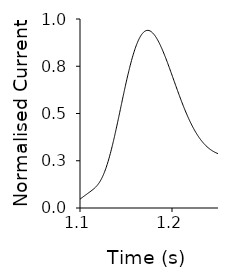
| Category | Ammonium pH 8 in pH 5 out |
|---|---|
| 0.0 | -0.187 |
| 0.001 | -0.187 |
| 0.002 | -0.187 |
| 0.003 | -0.187 |
| 0.004 | -0.187 |
| 0.005 | -0.187 |
| 0.006 | -0.187 |
| 0.007 | -0.187 |
| 0.008 | -0.186 |
| 0.009 | -0.186 |
| 0.01 | -0.185 |
| 0.011 | -0.185 |
| 0.012 | -0.184 |
| 0.013 | -0.184 |
| 0.014 | -0.183 |
| 0.015 | -0.182 |
| 0.016 | -0.181 |
| 0.017 | -0.18 |
| 0.018 | -0.179 |
| 0.019 | -0.178 |
| 0.02 | -0.177 |
| 0.021 | -0.176 |
| 0.022 | -0.175 |
| 0.023 | -0.174 |
| 0.024 | -0.173 |
| 0.025 | -0.172 |
| 0.026 | -0.171 |
| 0.027 | -0.17 |
| 0.028 | -0.17 |
| 0.029 | -0.169 |
| 0.03 | -0.169 |
| 0.031 | -0.169 |
| 0.032 | -0.169 |
| 0.033 | -0.17 |
| 0.034 | -0.17 |
| 0.035 | -0.171 |
| 0.036 | -0.172 |
| 0.037 | -0.173 |
| 0.038 | -0.174 |
| 0.039 | -0.175 |
| 0.04 | -0.176 |
| 0.041 | -0.178 |
| 0.042 | -0.179 |
| 0.043 | -0.181 |
| 0.044 | -0.182 |
| 0.045 | -0.183 |
| 0.046 | -0.185 |
| 0.047 | -0.186 |
| 0.048 | -0.187 |
| 0.049 | -0.188 |
| 0.05 | -0.189 |
| 0.051 | -0.19 |
| 0.052 | -0.19 |
| 0.053 | -0.191 |
| 0.054 | -0.191 |
| 0.055 | -0.191 |
| 0.056 | -0.19 |
| 0.057 | -0.19 |
| 0.058 | -0.189 |
| 0.059 | -0.188 |
| 0.06 | -0.187 |
| 0.061 | -0.186 |
| 0.062 | -0.184 |
| 0.063 | -0.182 |
| 0.064 | -0.18 |
| 0.065 | -0.178 |
| 0.066 | -0.176 |
| 0.067 | -0.173 |
| 0.068 | -0.17 |
| 0.069 | -0.168 |
| 0.07 | -0.165 |
| 0.071 | -0.162 |
| 0.072 | -0.159 |
| 0.073 | -0.156 |
| 0.074 | -0.153 |
| 0.075 | -0.149 |
| 0.076 | -0.146 |
| 0.077 | -0.143 |
| 0.078 | -0.14 |
| 0.079 | -0.137 |
| 0.08 | -0.134 |
| 0.081 | -0.131 |
| 0.082 | -0.128 |
| 0.083 | -0.126 |
| 0.084 | -0.123 |
| 0.085 | -0.121 |
| 0.086 | -0.118 |
| 0.087 | -0.116 |
| 0.088 | -0.115 |
| 0.089 | -0.113 |
| 0.09 | -0.112 |
| 0.091 | -0.11 |
| 0.092 | -0.109 |
| 0.093 | -0.109 |
| 0.094 | -0.109 |
| 0.095 | -0.109 |
| 0.096 | -0.109 |
| 0.097 | -0.11 |
| 0.098 | -0.111 |
| 0.099 | -0.112 |
| 0.1 | -0.114 |
| 0.101 | -0.116 |
| 0.102 | -0.118 |
| 0.103 | -0.121 |
| 0.104 | -0.124 |
| 0.105 | -0.128 |
| 0.106 | -0.132 |
| 0.107 | -0.136 |
| 0.108 | -0.141 |
| 0.109 | -0.146 |
| 0.11 | -0.151 |
| 0.111 | -0.157 |
| 0.112 | -0.163 |
| 0.113 | -0.169 |
| 0.114 | -0.175 |
| 0.115 | -0.182 |
| 0.116 | -0.189 |
| 0.117 | -0.196 |
| 0.118 | -0.203 |
| 0.119 | -0.211 |
| 0.12 | -0.218 |
| 0.121 | -0.226 |
| 0.122 | -0.234 |
| 0.123 | -0.241 |
| 0.124 | -0.249 |
| 0.125 | -0.257 |
| 0.126 | -0.264 |
| 0.127 | -0.272 |
| 0.128 | -0.279 |
| 0.129 | -0.286 |
| 0.13 | -0.293 |
| 0.131 | -0.3 |
| 0.132 | -0.307 |
| 0.133 | -0.313 |
| 0.134 | -0.319 |
| 0.135 | -0.325 |
| 0.136 | -0.33 |
| 0.137 | -0.335 |
| 0.138 | -0.339 |
| 0.139 | -0.344 |
| 0.14 | -0.347 |
| 0.141 | -0.351 |
| 0.142 | -0.353 |
| 0.143 | -0.356 |
| 0.144 | -0.358 |
| 0.145 | -0.359 |
| 0.146 | -0.36 |
| 0.147 | -0.361 |
| 0.148 | -0.361 |
| 0.149 | -0.36 |
| 0.15 | -0.359 |
| 0.151 | -0.358 |
| 0.152 | -0.356 |
| 0.153 | -0.354 |
| 0.154 | -0.351 |
| 0.155 | -0.347 |
| 0.156 | -0.344 |
| 0.157 | -0.34 |
| 0.158 | -0.335 |
| 0.159 | -0.33 |
| 0.16 | -0.325 |
| 0.161 | -0.32 |
| 0.162 | -0.314 |
| 0.163 | -0.307 |
| 0.164 | -0.301 |
| 0.165 | -0.294 |
| 0.166 | -0.287 |
| 0.167 | -0.28 |
| 0.168 | -0.272 |
| 0.169 | -0.264 |
| 0.17 | -0.256 |
| 0.171 | -0.248 |
| 0.172 | -0.24 |
| 0.173 | -0.232 |
| 0.174 | -0.223 |
| 0.175 | -0.215 |
| 0.176 | -0.206 |
| 0.177 | -0.197 |
| 0.178 | -0.189 |
| 0.179 | -0.18 |
| 0.18 | -0.171 |
| 0.181 | -0.163 |
| 0.182 | -0.154 |
| 0.183 | -0.146 |
| 0.184 | -0.138 |
| 0.185 | -0.129 |
| 0.186 | -0.121 |
| 0.187 | -0.113 |
| 0.188 | -0.105 |
| 0.189 | -0.098 |
| 0.19 | -0.09 |
| 0.191 | -0.083 |
| 0.192 | -0.076 |
| 0.193 | -0.069 |
| 0.194 | -0.062 |
| 0.195 | -0.056 |
| 0.196 | -0.049 |
| 0.197 | -0.044 |
| 0.198 | -0.038 |
| 0.199 | -0.033 |
| 0.2 | -0.027 |
| 0.201 | -0.023 |
| 0.202 | -0.018 |
| 0.203 | -0.014 |
| 0.204 | -0.01 |
| 0.205 | -0.006 |
| 0.206 | -0.003 |
| 0.207 | 0.001 |
| 0.208 | 0.003 |
| 0.209 | 0.006 |
| 0.21 | 0.008 |
| 0.211 | 0.01 |
| 0.212 | 0.012 |
| 0.213 | 0.014 |
| 0.214 | 0.015 |
| 0.215 | 0.016 |
| 0.216 | 0.017 |
| 0.217 | 0.017 |
| 0.218 | 0.018 |
| 0.219 | 0.018 |
| 0.22 | 0.018 |
| 0.221 | 0.017 |
| 0.222 | 0.017 |
| 0.223 | 0.016 |
| 0.224 | 0.015 |
| 0.225 | 0.014 |
| 0.226 | 0.013 |
| 0.227 | 0.012 |
| 0.228 | 0.011 |
| 0.229 | 0.009 |
| 0.23 | 0.007 |
| 0.231 | 0.006 |
| 0.232 | 0.004 |
| 0.233 | 0.002 |
| 0.234 | 0 |
| 0.235 | -0.002 |
| 0.236 | -0.005 |
| 0.237 | -0.007 |
| 0.238 | -0.009 |
| 0.239 | -0.011 |
| 0.24 | -0.014 |
| 0.241 | -0.016 |
| 0.242 | -0.019 |
| 0.243 | -0.021 |
| 0.244 | -0.024 |
| 0.245 | -0.026 |
| 0.246 | -0.028 |
| 0.247 | -0.031 |
| 0.248 | -0.033 |
| 0.249 | -0.036 |
| 0.25 | -0.038 |
| 0.251 | -0.041 |
| 0.252 | -0.043 |
| 0.253 | -0.046 |
| 0.254 | -0.048 |
| 0.255 | -0.05 |
| 0.256 | -0.053 |
| 0.257 | -0.055 |
| 0.258 | -0.057 |
| 0.259 | -0.059 |
| 0.26 | -0.061 |
| 0.261 | -0.063 |
| 0.262 | -0.065 |
| 0.263 | -0.067 |
| 0.264 | -0.069 |
| 0.265 | -0.071 |
| 0.266 | -0.073 |
| 0.267 | -0.075 |
| 0.268 | -0.077 |
| 0.269 | -0.078 |
| 0.27 | -0.08 |
| 0.271 | -0.081 |
| 0.272 | -0.083 |
| 0.273 | -0.084 |
| 0.274 | -0.085 |
| 0.275 | -0.087 |
| 0.276 | -0.088 |
| 0.277 | -0.089 |
| 0.278 | -0.09 |
| 0.279 | -0.091 |
| 0.28 | -0.092 |
| 0.281 | -0.093 |
| 0.282 | -0.094 |
| 0.283 | -0.095 |
| 0.284 | -0.096 |
| 0.285 | -0.096 |
| 0.286 | -0.097 |
| 0.287 | -0.098 |
| 0.288 | -0.098 |
| 0.289 | -0.099 |
| 0.29 | -0.099 |
| 0.291 | -0.1 |
| 0.292 | -0.1 |
| 0.293 | -0.1 |
| 0.294 | -0.101 |
| 0.295 | -0.101 |
| 0.296 | -0.102 |
| 0.297 | -0.102 |
| 0.298 | -0.102 |
| 0.299 | -0.102 |
| 0.3 | -0.103 |
| 0.301 | -0.103 |
| 0.302 | -0.103 |
| 0.303 | -0.103 |
| 0.304 | -0.104 |
| 0.305 | -0.104 |
| 0.306 | -0.104 |
| 0.307 | -0.105 |
| 0.308 | -0.105 |
| 0.309 | -0.105 |
| 0.31 | -0.106 |
| 0.311 | -0.106 |
| 0.312 | -0.107 |
| 0.313 | -0.108 |
| 0.314 | -0.108 |
| 0.315 | -0.109 |
| 0.316 | -0.11 |
| 0.317 | -0.112 |
| 0.318 | -0.113 |
| 0.319 | -0.114 |
| 0.32 | -0.116 |
| 0.321 | -0.118 |
| 0.322 | -0.12 |
| 0.323 | -0.122 |
| 0.324 | -0.124 |
| 0.325 | -0.126 |
| 0.326 | -0.128 |
| 0.327 | -0.131 |
| 0.328 | -0.134 |
| 0.329 | -0.136 |
| 0.33 | -0.139 |
| 0.331 | -0.141 |
| 0.332 | -0.144 |
| 0.333 | -0.147 |
| 0.334 | -0.149 |
| 0.335 | -0.152 |
| 0.336 | -0.154 |
| 0.337 | -0.156 |
| 0.338 | -0.158 |
| 0.339 | -0.16 |
| 0.34 | -0.161 |
| 0.341 | -0.162 |
| 0.342 | -0.162 |
| 0.343 | -0.161 |
| 0.344 | -0.159 |
| 0.345 | -0.156 |
| 0.346 | -0.152 |
| 0.347 | -0.147 |
| 0.348 | -0.14 |
| 0.349 | -0.132 |
| 0.35 | -0.122 |
| 0.351 | -0.11 |
| 0.352 | -0.097 |
| 0.353 | -0.081 |
| 0.354 | -0.064 |
| 0.355 | -0.044 |
| 0.356 | -0.022 |
| 0.357 | 0.001 |
| 0.358 | 0.027 |
| 0.359 | 0.056 |
| 0.36 | 0.086 |
| 0.361 | 0.119 |
| 0.362 | 0.154 |
| 0.363 | 0.191 |
| 0.364 | 0.23 |
| 0.365 | 0.271 |
| 0.366 | 0.314 |
| 0.367 | 0.359 |
| 0.368 | 0.406 |
| 0.369 | 0.454 |
| 0.37 | 0.503 |
| 0.371 | 0.554 |
| 0.372 | 0.606 |
| 0.373 | 0.658 |
| 0.374 | 0.712 |
| 0.375 | 0.765 |
| 0.376 | 0.82 |
| 0.377 | 0.874 |
| 0.378 | 0.929 |
| 0.379 | 0.983 |
| 0.38 | 1.037 |
| 0.381 | 1.091 |
| 0.382 | 1.144 |
| 0.383 | 1.196 |
| 0.384 | 1.247 |
| 0.385 | 1.297 |
| 0.386 | 1.346 |
| 0.387 | 1.393 |
| 0.388 | 1.44 |
| 0.389 | 1.484 |
| 0.39 | 1.527 |
| 0.391 | 1.568 |
| 0.392 | 1.607 |
| 0.393 | 1.645 |
| 0.394 | 1.68 |
| 0.395 | 1.714 |
| 0.396 | 1.746 |
| 0.397 | 1.775 |
| 0.398 | 1.803 |
| 0.399 | 1.828 |
| 0.4 | 1.852 |
| 0.401 | 1.873 |
| 0.402 | 1.892 |
| 0.403 | 1.909 |
| 0.404 | 1.924 |
| 0.405 | 1.937 |
| 0.406 | 1.948 |
| 0.407 | 1.956 |
| 0.408 | 1.963 |
| 0.409 | 1.968 |
| 0.41 | 1.97 |
| 0.411 | 1.971 |
| 0.412 | 1.971 |
| 0.413 | 1.968 |
| 0.414 | 1.964 |
| 0.415 | 1.957 |
| 0.416 | 1.95 |
| 0.417 | 1.941 |
| 0.418 | 1.93 |
| 0.419 | 1.918 |
| 0.42 | 1.905 |
| 0.421 | 1.89 |
| 0.422 | 1.874 |
| 0.423 | 1.857 |
| 0.424 | 1.839 |
| 0.425 | 1.82 |
| 0.426 | 1.8 |
| 0.427 | 1.779 |
| 0.428 | 1.757 |
| 0.429 | 1.735 |
| 0.43 | 1.712 |
| 0.431 | 1.688 |
| 0.432 | 1.664 |
| 0.433 | 1.64 |
| 0.434 | 1.615 |
| 0.435 | 1.589 |
| 0.436 | 1.564 |
| 0.437 | 1.538 |
| 0.438 | 1.512 |
| 0.439 | 1.486 |
| 0.44 | 1.46 |
| 0.441 | 1.433 |
| 0.442 | 1.407 |
| 0.443 | 1.38 |
| 0.444 | 1.354 |
| 0.445 | 1.327 |
| 0.446 | 1.301 |
| 0.447 | 1.275 |
| 0.448 | 1.249 |
| 0.449 | 1.223 |
| 0.45 | 1.197 |
| 0.451 | 1.172 |
| 0.452 | 1.147 |
| 0.453 | 1.122 |
| 0.454 | 1.097 |
| 0.455 | 1.073 |
| 0.456 | 1.049 |
| 0.457 | 1.026 |
| 0.458 | 1.003 |
| 0.459 | 0.98 |
| 0.46 | 0.958 |
| 0.461 | 0.936 |
| 0.462 | 0.915 |
| 0.463 | 0.894 |
| 0.464 | 0.874 |
| 0.465 | 0.854 |
| 0.466 | 0.835 |
| 0.467 | 0.816 |
| 0.468 | 0.798 |
| 0.469 | 0.78 |
| 0.47 | 0.764 |
| 0.471 | 0.747 |
| 0.472 | 0.732 |
| 0.473 | 0.716 |
| 0.474 | 0.702 |
| 0.475 | 0.688 |
| 0.476 | 0.675 |
| 0.477 | 0.662 |
| 0.478 | 0.65 |
| 0.479 | 0.639 |
| 0.48 | 0.628 |
| 0.481 | 0.618 |
| 0.482 | 0.608 |
| 0.483 | 0.599 |
| 0.484 | 0.591 |
| 0.485 | 0.583 |
| 0.486 | 0.576 |
| 0.487 | 0.569 |
| 0.488 | 0.562 |
| 0.489 | 0.556 |
| 0.49 | 0.551 |
| 0.491 | 0.546 |
| 0.492 | 0.542 |
| 0.493 | 0.537 |
| 0.494 | 0.534 |
| 0.495 | 0.53 |
| 0.496 | 0.527 |
| 0.497 | 0.525 |
| 0.498 | 0.523 |
| 0.499 | 0.521 |
| 0.5 | 0.519 |
| 0.501 | 0.517 |
| 0.502 | 0.516 |
| 0.503 | 0.515 |
| 0.504 | 0.515 |
| 0.505 | 0.514 |
| 0.506 | 0.514 |
| 0.507 | 0.514 |
| 0.508 | 0.514 |
| 0.509 | 0.514 |
| 0.51 | 0.514 |
| 0.511 | 0.515 |
| 0.512 | 0.515 |
| 0.513 | 0.516 |
| 0.514 | 0.516 |
| 0.515 | 0.517 |
| 0.516 | 0.517 |
| 0.517 | 0.518 |
| 0.518 | 0.519 |
| 0.519 | 0.519 |
| 0.52 | 0.52 |
| 0.521 | 0.521 |
| 0.522 | 0.521 |
| 0.523 | 0.522 |
| 0.524 | 0.523 |
| 0.525 | 0.523 |
| 0.526 | 0.523 |
| 0.527 | 0.524 |
| 0.528 | 0.524 |
| 0.529 | 0.524 |
| 0.53 | 0.524 |
| 0.531 | 0.524 |
| 0.532 | 0.524 |
| 0.533 | 0.524 |
| 0.534 | 0.524 |
| 0.535 | 0.523 |
| 0.536 | 0.523 |
| 0.537 | 0.522 |
| 0.538 | 0.522 |
| 0.539 | 0.521 |
| 0.54 | 0.52 |
| 0.541 | 0.519 |
| 0.542 | 0.518 |
| 0.543 | 0.516 |
| 0.544 | 0.515 |
| 0.545 | 0.513 |
| 0.546 | 0.512 |
| 0.547 | 0.51 |
| 0.548 | 0.508 |
| 0.549 | 0.505 |
| 0.55 | 0.503 |
| 0.551 | 0.501 |
| 0.552 | 0.498 |
| 0.553 | 0.495 |
| 0.554 | 0.492 |
| 0.555 | 0.489 |
| 0.556 | 0.486 |
| 0.557 | 0.482 |
| 0.558 | 0.479 |
| 0.559 | 0.475 |
| 0.56 | 0.471 |
| 0.561 | 0.467 |
| 0.562 | 0.463 |
| 0.563 | 0.459 |
| 0.564 | 0.454 |
| 0.565 | 0.45 |
| 0.566 | 0.445 |
| 0.567 | 0.44 |
| 0.568 | 0.436 |
| 0.569 | 0.431 |
| 0.57 | 0.425 |
| 0.571 | 0.42 |
| 0.572 | 0.415 |
| 0.573 | 0.41 |
| 0.574 | 0.404 |
| 0.575 | 0.399 |
| 0.576 | 0.393 |
| 0.577 | 0.388 |
| 0.578 | 0.382 |
| 0.579 | 0.377 |
| 0.58 | 0.371 |
| 0.581 | 0.365 |
| 0.582 | 0.36 |
| 0.583 | 0.354 |
| 0.584 | 0.348 |
| 0.585 | 0.342 |
| 0.586 | 0.336 |
| 0.587 | 0.331 |
| 0.588 | 0.325 |
| 0.589 | 0.319 |
| 0.59 | 0.313 |
| 0.591 | 0.307 |
| 0.592 | 0.301 |
| 0.593 | 0.295 |
| 0.594 | 0.289 |
| 0.595 | 0.283 |
| 0.596 | 0.277 |
| 0.597 | 0.271 |
| 0.598 | 0.265 |
| 0.599 | 0.26 |
| 0.6 | 0.254 |
| 0.601 | 0.248 |
| 0.602 | 0.242 |
| 0.603 | 0.236 |
| 0.604 | 0.23 |
| 0.605 | 0.225 |
| 0.606 | 0.219 |
| 0.607 | 0.213 |
| 0.608 | 0.207 |
| 0.609 | 0.202 |
| 0.61 | 0.196 |
| 0.611 | 0.191 |
| 0.612 | 0.186 |
| 0.613 | 0.18 |
| 0.614 | 0.175 |
| 0.615 | 0.17 |
| 0.616 | 0.165 |
| 0.617 | 0.16 |
| 0.618 | 0.155 |
| 0.619 | 0.15 |
| 0.62 | 0.146 |
| 0.621 | 0.141 |
| 0.622 | 0.137 |
| 0.623 | 0.133 |
| 0.624 | 0.128 |
| 0.625 | 0.124 |
| 0.626 | 0.12 |
| 0.627 | 0.117 |
| 0.628 | 0.113 |
| 0.629 | 0.109 |
| 0.63 | 0.106 |
| 0.631 | 0.102 |
| 0.632 | 0.099 |
| 0.633 | 0.095 |
| 0.634 | 0.092 |
| 0.635 | 0.089 |
| 0.636 | 0.086 |
| 0.637 | 0.083 |
| 0.638 | 0.08 |
| 0.639 | 0.077 |
| 0.64 | 0.074 |
| 0.641 | 0.072 |
| 0.642 | 0.069 |
| 0.643 | 0.066 |
| 0.644 | 0.064 |
| 0.645 | 0.061 |
| 0.646 | 0.059 |
| 0.647 | 0.057 |
| 0.648 | 0.055 |
| 0.649 | 0.052 |
| 0.65 | 0.05 |
| 0.651 | 0.048 |
| 0.652 | 0.046 |
| 0.653 | 0.044 |
| 0.654 | 0.042 |
| 0.655 | 0.041 |
| 0.656 | 0.039 |
| 0.657 | 0.038 |
| 0.658 | 0.036 |
| 0.659 | 0.035 |
| 0.66 | 0.033 |
| 0.661 | 0.032 |
| 0.662 | 0.031 |
| 0.663 | 0.03 |
| 0.664 | 0.03 |
| 0.665 | 0.029 |
| 0.666 | 0.028 |
| 0.667 | 0.028 |
| 0.668 | 0.028 |
| 0.669 | 0.027 |
| 0.67 | 0.027 |
| 0.671 | 0.028 |
| 0.672 | 0.028 |
| 0.673 | 0.028 |
| 0.674 | 0.029 |
| 0.675 | 0.029 |
| 0.676 | 0.03 |
| 0.677 | 0.031 |
| 0.678 | 0.032 |
| 0.679 | 0.033 |
| 0.68 | 0.034 |
| 0.681 | 0.036 |
| 0.682 | 0.037 |
| 0.683 | 0.039 |
| 0.684 | 0.04 |
| 0.685 | 0.042 |
| 0.686 | 0.043 |
| 0.687 | 0.045 |
| 0.688 | 0.047 |
| 0.689 | 0.048 |
| 0.69 | 0.05 |
| 0.691 | 0.052 |
| 0.692 | 0.054 |
| 0.693 | 0.055 |
| 0.694 | 0.057 |
| 0.695 | 0.059 |
| 0.696 | 0.06 |
| 0.697 | 0.062 |
| 0.698 | 0.063 |
| 0.699 | 0.065 |
| 0.7 | 0.066 |
| 0.701 | 0.067 |
| 0.702 | 0.068 |
| 0.703 | 0.069 |
| 0.704 | 0.07 |
| 0.705 | 0.071 |
| 0.706 | 0.072 |
| 0.707 | 0.073 |
| 0.708 | 0.073 |
| 0.709 | 0.074 |
| 0.71 | 0.074 |
| 0.711 | 0.075 |
| 0.712 | 0.075 |
| 0.713 | 0.075 |
| 0.714 | 0.076 |
| 0.715 | 0.076 |
| 0.716 | 0.076 |
| 0.717 | 0.076 |
| 0.718 | 0.076 |
| 0.719 | 0.075 |
| 0.72 | 0.075 |
| 0.721 | 0.075 |
| 0.722 | 0.075 |
| 0.723 | 0.075 |
| 0.724 | 0.074 |
| 0.725 | 0.074 |
| 0.726 | 0.074 |
| 0.727 | 0.073 |
| 0.728 | 0.073 |
| 0.729 | 0.073 |
| 0.73 | 0.073 |
| 0.731 | 0.072 |
| 0.732 | 0.072 |
| 0.733 | 0.072 |
| 0.734 | 0.071 |
| 0.735 | 0.071 |
| 0.736 | 0.071 |
| 0.737 | 0.07 |
| 0.738 | 0.07 |
| 0.739 | 0.069 |
| 0.74 | 0.069 |
| 0.741 | 0.069 |
| 0.742 | 0.068 |
| 0.743 | 0.068 |
| 0.744 | 0.067 |
| 0.745 | 0.067 |
| 0.746 | 0.067 |
| 0.747 | 0.066 |
| 0.748 | 0.066 |
| 0.749 | 0.065 |
| 0.75 | 0.064 |
| 0.751 | 0.064 |
| 0.752 | 0.063 |
| 0.753 | 0.063 |
| 0.754 | 0.062 |
| 0.755 | 0.061 |
| 0.756 | 0.06 |
| 0.757 | 0.06 |
| 0.758 | 0.059 |
| 0.759 | 0.058 |
| 0.76 | 0.057 |
| 0.761 | 0.056 |
| 0.762 | 0.055 |
| 0.763 | 0.054 |
| 0.764 | 0.054 |
| 0.765 | 0.053 |
| 0.766 | 0.052 |
| 0.767 | 0.051 |
| 0.768 | 0.05 |
| 0.769 | 0.049 |
| 0.77 | 0.048 |
| 0.771 | 0.047 |
| 0.772 | 0.046 |
| 0.773 | 0.045 |
| 0.774 | 0.044 |
| 0.775 | 0.043 |
| 0.776 | 0.042 |
| 0.777 | 0.041 |
| 0.778 | 0.04 |
| 0.779 | 0.039 |
| 0.78 | 0.038 |
| 0.781 | 0.038 |
| 0.782 | 0.037 |
| 0.783 | 0.036 |
| 0.784 | 0.035 |
| 0.785 | 0.034 |
| 0.786 | 0.033 |
| 0.787 | 0.032 |
| 0.788 | 0.031 |
| 0.789 | 0.03 |
| 0.79 | 0.03 |
| 0.791 | 0.029 |
| 0.792 | 0.028 |
| 0.793 | 0.027 |
| 0.794 | 0.026 |
| 0.795 | 0.025 |
| 0.796 | 0.024 |
| 0.797 | 0.023 |
| 0.798 | 0.022 |
| 0.799 | 0.021 |
| 0.8 | 0.02 |
| 0.801 | 0.019 |
| 0.802 | 0.018 |
| 0.803 | 0.017 |
| 0.804 | 0.017 |
| 0.805 | 0.016 |
| 0.806 | 0.015 |
| 0.807 | 0.014 |
| 0.808 | 0.013 |
| 0.809 | 0.012 |
| 0.81 | 0.011 |
| 0.811 | 0.011 |
| 0.812 | 0.01 |
| 0.813 | 0.009 |
| 0.814 | 0.008 |
| 0.815 | 0.008 |
| 0.816 | 0.007 |
| 0.817 | 0.006 |
| 0.818 | 0.006 |
| 0.819 | 0.005 |
| 0.82 | 0.005 |
| 0.821 | 0.005 |
| 0.822 | 0.004 |
| 0.823 | 0.004 |
| 0.824 | 0.004 |
| 0.825 | 0.003 |
| 0.826 | 0.003 |
| 0.827 | 0.003 |
| 0.828 | 0.003 |
| 0.829 | 0.003 |
| 0.83 | 0.003 |
| 0.831 | 0.003 |
| 0.832 | 0.003 |
| 0.833 | 0.003 |
| 0.834 | 0.003 |
| 0.835 | 0.003 |
| 0.836 | 0.003 |
| 0.837 | 0.003 |
| 0.838 | 0.003 |
| 0.839 | 0.003 |
| 0.84 | 0.003 |
| 0.841 | 0.003 |
| 0.842 | 0.003 |
| 0.843 | 0.003 |
| 0.844 | 0.003 |
| 0.845 | 0.003 |
| 0.846 | 0.003 |
| 0.847 | 0.002 |
| 0.848 | 0.002 |
| 0.849 | 0.002 |
| 0.85 | 0.002 |
| 0.851 | 0.001 |
| 0.852 | 0.001 |
| 0.853 | 0.001 |
| 0.854 | 0 |
| 0.855 | 0 |
| 0.856 | -0.001 |
| 0.857 | -0.001 |
| 0.858 | -0.002 |
| 0.859 | -0.002 |
| 0.86 | -0.003 |
| 0.861 | -0.003 |
| 0.862 | -0.004 |
| 0.863 | -0.005 |
| 0.864 | -0.005 |
| 0.865 | -0.006 |
| 0.866 | -0.006 |
| 0.867 | -0.007 |
| 0.868 | -0.007 |
| 0.869 | -0.008 |
| 0.87 | -0.008 |
| 0.871 | -0.009 |
| 0.872 | -0.009 |
| 0.873 | -0.01 |
| 0.874 | -0.01 |
| 0.875 | -0.01 |
| 0.876 | -0.011 |
| 0.877 | -0.011 |
| 0.878 | -0.011 |
| 0.879 | -0.011 |
| 0.88 | -0.012 |
| 0.881 | -0.012 |
| 0.882 | -0.012 |
| 0.883 | -0.012 |
| 0.884 | -0.012 |
| 0.885 | -0.011 |
| 0.886 | -0.011 |
| 0.887 | -0.011 |
| 0.888 | -0.011 |
| 0.889 | -0.011 |
| 0.89 | -0.011 |
| 0.891 | -0.01 |
| 0.892 | -0.01 |
| 0.893 | -0.01 |
| 0.894 | -0.009 |
| 0.895 | -0.009 |
| 0.896 | -0.009 |
| 0.897 | -0.009 |
| 0.898 | -0.008 |
| 0.899 | -0.008 |
| 0.9 | -0.008 |
| 0.901 | -0.008 |
| 0.902 | -0.008 |
| 0.903 | -0.008 |
| 0.904 | -0.007 |
| 0.905 | -0.007 |
| 0.906 | -0.007 |
| 0.907 | -0.007 |
| 0.908 | -0.007 |
| 0.909 | -0.007 |
| 0.91 | -0.008 |
| 0.911 | -0.008 |
| 0.912 | -0.008 |
| 0.913 | -0.008 |
| 0.914 | -0.008 |
| 0.915 | -0.008 |
| 0.916 | -0.009 |
| 0.917 | -0.009 |
| 0.918 | -0.009 |
| 0.919 | -0.009 |
| 0.92 | -0.01 |
| 0.921 | -0.01 |
| 0.922 | -0.01 |
| 0.923 | -0.01 |
| 0.924 | -0.01 |
| 0.925 | -0.011 |
| 0.926 | -0.011 |
| 0.927 | -0.011 |
| 0.928 | -0.011 |
| 0.929 | -0.011 |
| 0.93 | -0.012 |
| 0.931 | -0.012 |
| 0.932 | -0.012 |
| 0.933 | -0.012 |
| 0.934 | -0.012 |
| 0.935 | -0.012 |
| 0.936 | -0.012 |
| 0.937 | -0.013 |
| 0.938 | -0.013 |
| 0.939 | -0.013 |
| 0.94 | -0.013 |
| 0.941 | -0.013 |
| 0.942 | -0.013 |
| 0.943 | -0.013 |
| 0.944 | -0.014 |
| 0.945 | -0.014 |
| 0.946 | -0.014 |
| 0.947 | -0.015 |
| 0.948 | -0.015 |
| 0.949 | -0.015 |
| 0.95 | -0.016 |
| 0.951 | -0.016 |
| 0.952 | -0.017 |
| 0.953 | -0.017 |
| 0.954 | -0.018 |
| 0.955 | -0.019 |
| 0.956 | -0.019 |
| 0.957 | -0.02 |
| 0.958 | -0.021 |
| 0.959 | -0.021 |
| 0.96 | -0.022 |
| 0.961 | -0.023 |
| 0.962 | -0.024 |
| 0.963 | -0.025 |
| 0.964 | -0.025 |
| 0.965 | -0.026 |
| 0.966 | -0.027 |
| 0.967 | -0.028 |
| 0.968 | -0.029 |
| 0.969 | -0.029 |
| 0.97 | -0.03 |
| 0.971 | -0.031 |
| 0.972 | -0.032 |
| 0.973 | -0.032 |
| 0.974 | -0.033 |
| 0.975 | -0.033 |
| 0.976 | -0.034 |
| 0.977 | -0.035 |
| 0.978 | -0.035 |
| 0.979 | -0.036 |
| 0.98 | -0.036 |
| 0.981 | -0.036 |
| 0.982 | -0.037 |
| 0.983 | -0.037 |
| 0.984 | -0.037 |
| 0.985 | -0.038 |
| 0.986 | -0.038 |
| 0.987 | -0.038 |
| 0.988 | -0.038 |
| 0.989 | -0.039 |
| 0.99 | -0.039 |
| 0.991 | -0.039 |
| 0.992 | -0.039 |
| 0.993 | -0.039 |
| 0.994 | -0.039 |
| 0.995 | -0.04 |
| 0.996 | -0.04 |
| 0.997 | -0.04 |
| 0.998 | -0.04 |
| 0.999 | -0.04 |
| 1.0 | -0.04 |
| 1.001 | -0.04 |
| 1.002 | -0.04 |
| 1.003 | -0.04 |
| 1.004 | -0.04 |
| 1.005 | -0.04 |
| 1.006 | -0.04 |
| 1.007 | -0.04 |
| 1.008 | -0.04 |
| 1.009 | -0.04 |
| 1.01 | -0.04 |
| 1.011 | -0.04 |
| 1.012 | -0.04 |
| 1.013 | -0.04 |
| 1.014 | -0.04 |
| 1.015 | -0.04 |
| 1.016 | -0.04 |
| 1.017 | -0.04 |
| 1.018 | -0.039 |
| 1.019 | -0.039 |
| 1.02 | -0.039 |
| 1.021 | -0.039 |
| 1.022 | -0.039 |
| 1.023 | -0.038 |
| 1.024 | -0.038 |
| 1.025 | -0.038 |
| 1.026 | -0.038 |
| 1.027 | -0.037 |
| 1.028 | -0.037 |
| 1.029 | -0.037 |
| 1.03 | -0.037 |
| 1.031 | -0.037 |
| 1.032 | -0.036 |
| 1.033 | -0.036 |
| 1.034 | -0.036 |
| 1.035 | -0.036 |
| 1.036 | -0.036 |
| 1.037 | -0.036 |
| 1.038 | -0.036 |
| 1.039 | -0.036 |
| 1.04 | -0.036 |
| 1.041 | -0.037 |
| 1.042 | -0.037 |
| 1.043 | -0.037 |
| 1.044 | -0.038 |
| 1.045 | -0.038 |
| 1.046 | -0.039 |
| 1.047 | -0.039 |
| 1.048 | -0.04 |
| 1.049 | -0.041 |
| 1.05 | -0.041 |
| 1.051 | -0.042 |
| 1.052 | -0.043 |
| 1.053 | -0.044 |
| 1.054 | -0.044 |
| 1.055 | -0.045 |
| 1.056 | -0.045 |
| 1.057 | -0.046 |
| 1.058 | -0.046 |
| 1.059 | -0.047 |
| 1.06 | -0.047 |
| 1.061 | -0.047 |
| 1.062 | -0.047 |
| 1.063 | -0.046 |
| 1.064 | -0.046 |
| 1.065 | -0.046 |
| 1.066 | -0.045 |
| 1.067 | -0.044 |
| 1.068 | -0.043 |
| 1.069 | -0.042 |
| 1.07 | -0.04 |
| 1.071 | -0.039 |
| 1.072 | -0.037 |
| 1.073 | -0.035 |
| 1.074 | -0.034 |
| 1.075 | -0.031 |
| 1.076 | -0.029 |
| 1.077 | -0.027 |
| 1.078 | -0.024 |
| 1.079 | -0.022 |
| 1.08 | -0.019 |
| 1.081 | -0.016 |
| 1.082 | -0.014 |
| 1.083 | -0.011 |
| 1.084 | -0.008 |
| 1.085 | -0.005 |
| 1.086 | -0.001 |
| 1.087 | 0.002 |
| 1.088 | 0.005 |
| 1.089 | 0.008 |
| 1.09 | 0.012 |
| 1.091 | 0.015 |
| 1.092 | 0.019 |
| 1.093 | 0.022 |
| 1.094 | 0.025 |
| 1.095 | 0.029 |
| 1.096 | 0.032 |
| 1.097 | 0.036 |
| 1.098 | 0.04 |
| 1.099 | 0.043 |
| 1.1 | 0.047 |
| 1.101 | 0.05 |
| 1.102 | 0.054 |
| 1.103 | 0.058 |
| 1.104 | 0.061 |
| 1.105 | 0.065 |
| 1.106 | 0.068 |
| 1.107 | 0.072 |
| 1.108 | 0.076 |
| 1.109 | 0.079 |
| 1.11 | 0.083 |
| 1.111 | 0.086 |
| 1.112 | 0.09 |
| 1.113 | 0.094 |
| 1.114 | 0.097 |
| 1.115 | 0.101 |
| 1.116 | 0.106 |
| 1.117 | 0.11 |
| 1.118 | 0.116 |
| 1.119 | 0.121 |
| 1.12 | 0.128 |
| 1.121 | 0.135 |
| 1.122 | 0.142 |
| 1.123 | 0.151 |
| 1.124 | 0.161 |
| 1.125 | 0.171 |
| 1.126 | 0.182 |
| 1.127 | 0.195 |
| 1.128 | 0.208 |
| 1.129 | 0.222 |
| 1.13 | 0.238 |
| 1.131 | 0.254 |
| 1.132 | 0.271 |
| 1.133 | 0.289 |
| 1.134 | 0.308 |
| 1.135 | 0.327 |
| 1.136 | 0.347 |
| 1.137 | 0.368 |
| 1.138 | 0.389 |
| 1.139 | 0.411 |
| 1.14 | 0.433 |
| 1.141 | 0.456 |
| 1.142 | 0.479 |
| 1.143 | 0.502 |
| 1.144 | 0.525 |
| 1.145 | 0.548 |
| 1.146 | 0.571 |
| 1.147 | 0.594 |
| 1.148 | 0.616 |
| 1.149 | 0.639 |
| 1.15 | 0.661 |
| 1.151 | 0.682 |
| 1.152 | 0.703 |
| 1.153 | 0.723 |
| 1.154 | 0.743 |
| 1.155 | 0.762 |
| 1.156 | 0.78 |
| 1.157 | 0.798 |
| 1.158 | 0.814 |
| 1.159 | 0.83 |
| 1.16 | 0.844 |
| 1.161 | 0.858 |
| 1.162 | 0.871 |
| 1.163 | 0.882 |
| 1.164 | 0.893 |
| 1.165 | 0.902 |
| 1.166 | 0.911 |
| 1.167 | 0.918 |
| 1.168 | 0.924 |
| 1.169 | 0.929 |
| 1.17 | 0.934 |
| 1.171 | 0.937 |
| 1.172 | 0.939 |
| 1.173 | 0.94 |
| 1.174 | 0.94 |
| 1.175 | 0.939 |
| 1.176 | 0.937 |
| 1.177 | 0.934 |
| 1.178 | 0.931 |
| 1.179 | 0.926 |
| 1.18 | 0.921 |
| 1.181 | 0.915 |
| 1.182 | 0.908 |
| 1.183 | 0.901 |
| 1.184 | 0.892 |
| 1.185 | 0.884 |
| 1.186 | 0.874 |
| 1.187 | 0.864 |
| 1.188 | 0.854 |
| 1.189 | 0.843 |
| 1.19 | 0.832 |
| 1.191 | 0.82 |
| 1.192 | 0.808 |
| 1.193 | 0.796 |
| 1.194 | 0.783 |
| 1.195 | 0.77 |
| 1.196 | 0.757 |
| 1.197 | 0.744 |
| 1.198 | 0.73 |
| 1.199 | 0.717 |
| 1.2 | 0.703 |
| 1.201 | 0.689 |
| 1.202 | 0.676 |
| 1.203 | 0.662 |
| 1.204 | 0.648 |
| 1.205 | 0.635 |
| 1.206 | 0.621 |
| 1.207 | 0.608 |
| 1.208 | 0.595 |
| 1.209 | 0.582 |
| 1.21 | 0.569 |
| 1.211 | 0.556 |
| 1.212 | 0.544 |
| 1.213 | 0.532 |
| 1.214 | 0.52 |
| 1.215 | 0.508 |
| 1.216 | 0.496 |
| 1.217 | 0.485 |
| 1.218 | 0.474 |
| 1.219 | 0.464 |
| 1.22 | 0.454 |
| 1.221 | 0.444 |
| 1.222 | 0.434 |
| 1.223 | 0.425 |
| 1.224 | 0.416 |
| 1.225 | 0.407 |
| 1.226 | 0.399 |
| 1.227 | 0.391 |
| 1.228 | 0.383 |
| 1.229 | 0.376 |
| 1.23 | 0.369 |
| 1.231 | 0.363 |
| 1.232 | 0.356 |
| 1.233 | 0.35 |
| 1.234 | 0.344 |
| 1.235 | 0.339 |
| 1.236 | 0.334 |
| 1.237 | 0.329 |
| 1.238 | 0.324 |
| 1.239 | 0.32 |
| 1.24 | 0.316 |
| 1.241 | 0.312 |
| 1.242 | 0.309 |
| 1.243 | 0.305 |
| 1.244 | 0.302 |
| 1.245 | 0.299 |
| 1.246 | 0.296 |
| 1.247 | 0.294 |
| 1.248 | 0.292 |
| 1.249 | 0.289 |
| 1.25 | 0.288 |
| 1.251 | 0.286 |
| 1.252 | 0.284 |
| 1.253 | 0.282 |
| 1.254 | 0.281 |
| 1.255 | 0.28 |
| 1.256 | 0.279 |
| 1.257 | 0.277 |
| 1.258 | 0.276 |
| 1.259 | 0.276 |
| 1.26 | 0.275 |
| 1.261 | 0.274 |
| 1.262 | 0.273 |
| 1.263 | 0.272 |
| 1.264 | 0.272 |
| 1.265 | 0.271 |
| 1.266 | 0.271 |
| 1.267 | 0.27 |
| 1.268 | 0.27 |
| 1.269 | 0.269 |
| 1.27 | 0.269 |
| 1.271 | 0.268 |
| 1.272 | 0.268 |
| 1.273 | 0.267 |
| 1.274 | 0.267 |
| 1.275 | 0.266 |
| 1.276 | 0.266 |
| 1.277 | 0.265 |
| 1.278 | 0.264 |
| 1.279 | 0.264 |
| 1.28 | 0.263 |
| 1.281 | 0.263 |
| 1.282 | 0.262 |
| 1.283 | 0.261 |
| 1.284 | 0.26 |
| 1.285 | 0.26 |
| 1.286 | 0.259 |
| 1.287 | 0.258 |
| 1.288 | 0.257 |
| 1.289 | 0.256 |
| 1.29 | 0.255 |
| 1.291 | 0.254 |
| 1.292 | 0.253 |
| 1.293 | 0.252 |
| 1.294 | 0.251 |
| 1.295 | 0.25 |
| 1.296 | 0.248 |
| 1.297 | 0.247 |
| 1.298 | 0.246 |
| 1.299 | 0.245 |
| 1.3 | 0.243 |
| 1.301 | 0.242 |
| 1.302 | 0.241 |
| 1.303 | 0.239 |
| 1.304 | 0.238 |
| 1.305 | 0.236 |
| 1.306 | 0.235 |
| 1.307 | 0.233 |
| 1.308 | 0.232 |
| 1.309 | 0.23 |
| 1.31 | 0.229 |
| 1.311 | 0.227 |
| 1.312 | 0.225 |
| 1.313 | 0.224 |
| 1.314 | 0.222 |
| 1.315 | 0.221 |
| 1.316 | 0.219 |
| 1.317 | 0.217 |
| 1.318 | 0.216 |
| 1.319 | 0.214 |
| 1.32 | 0.213 |
| 1.321 | 0.211 |
| 1.322 | 0.21 |
| 1.323 | 0.208 |
| 1.324 | 0.206 |
| 1.325 | 0.205 |
| 1.326 | 0.203 |
| 1.327 | 0.202 |
| 1.328 | 0.2 |
| 1.329 | 0.199 |
| 1.33 | 0.198 |
| 1.331 | 0.196 |
| 1.332 | 0.195 |
| 1.333 | 0.194 |
| 1.334 | 0.192 |
| 1.335 | 0.191 |
| 1.336 | 0.19 |
| 1.337 | 0.189 |
| 1.338 | 0.187 |
| 1.339 | 0.186 |
| 1.34 | 0.185 |
| 1.341 | 0.184 |
| 1.342 | 0.183 |
| 1.343 | 0.182 |
| 1.344 | 0.181 |
| 1.345 | 0.18 |
| 1.346 | 0.179 |
| 1.347 | 0.178 |
| 1.348 | 0.177 |
| 1.349 | 0.176 |
| 1.35 | 0.175 |
| 1.351 | 0.174 |
| 1.352 | 0.173 |
| 1.353 | 0.172 |
| 1.354 | 0.172 |
| 1.355 | 0.171 |
| 1.356 | 0.17 |
| 1.357 | 0.169 |
| 1.358 | 0.168 |
| 1.359 | 0.168 |
| 1.36 | 0.167 |
| 1.361 | 0.166 |
| 1.362 | 0.165 |
| 1.363 | 0.164 |
| 1.364 | 0.164 |
| 1.365 | 0.163 |
| 1.366 | 0.162 |
| 1.367 | 0.161 |
| 1.368 | 0.16 |
| 1.369 | 0.16 |
| 1.37 | 0.159 |
| 1.371 | 0.158 |
| 1.372 | 0.157 |
| 1.373 | 0.156 |
| 1.374 | 0.156 |
| 1.375 | 0.155 |
| 1.376 | 0.154 |
| 1.377 | 0.153 |
| 1.378 | 0.152 |
| 1.379 | 0.151 |
| 1.38 | 0.15 |
| 1.381 | 0.149 |
| 1.382 | 0.148 |
| 1.383 | 0.148 |
| 1.384 | 0.147 |
| 1.385 | 0.146 |
| 1.386 | 0.145 |
| 1.387 | 0.144 |
| 1.388 | 0.143 |
| 1.389 | 0.142 |
| 1.39 | 0.141 |
| 1.391 | 0.14 |
| 1.392 | 0.139 |
| 1.393 | 0.138 |
| 1.394 | 0.137 |
| 1.395 | 0.136 |
| 1.396 | 0.135 |
| 1.397 | 0.134 |
| 1.398 | 0.133 |
| 1.399 | 0.132 |
| 1.4 | 0.131 |
| 1.401 | 0.13 |
| 1.402 | 0.129 |
| 1.403 | 0.128 |
| 1.404 | 0.127 |
| 1.405 | 0.126 |
| 1.406 | 0.125 |
| 1.407 | 0.124 |
| 1.408 | 0.123 |
| 1.409 | 0.123 |
| 1.41 | 0.122 |
| 1.411 | 0.121 |
| 1.412 | 0.12 |
| 1.413 | 0.12 |
| 1.414 | 0.119 |
| 1.415 | 0.118 |
| 1.416 | 0.118 |
| 1.417 | 0.117 |
| 1.418 | 0.116 |
| 1.419 | 0.116 |
| 1.42 | 0.115 |
| 1.421 | 0.115 |
| 1.422 | 0.114 |
| 1.423 | 0.114 |
| 1.424 | 0.113 |
| 1.425 | 0.113 |
| 1.426 | 0.112 |
| 1.427 | 0.112 |
| 1.428 | 0.112 |
| 1.429 | 0.111 |
| 1.43 | 0.111 |
| 1.431 | 0.11 |
| 1.432 | 0.11 |
| 1.433 | 0.11 |
| 1.434 | 0.109 |
| 1.435 | 0.109 |
| 1.436 | 0.109 |
| 1.437 | 0.108 |
| 1.438 | 0.108 |
| 1.439 | 0.108 |
| 1.44 | 0.107 |
| 1.441 | 0.107 |
| 1.442 | 0.107 |
| 1.443 | 0.106 |
| 1.444 | 0.106 |
| 1.445 | 0.106 |
| 1.446 | 0.105 |
| 1.447 | 0.105 |
| 1.448 | 0.104 |
| 1.449 | 0.104 |
| 1.45 | 0.104 |
| 1.451 | 0.103 |
| 1.452 | 0.103 |
| 1.453 | 0.102 |
| 1.454 | 0.102 |
| 1.455 | 0.101 |
| 1.456 | 0.101 |
| 1.457 | 0.1 |
| 1.458 | 0.099 |
| 1.459 | 0.099 |
| 1.46 | 0.098 |
| 1.461 | 0.098 |
| 1.462 | 0.097 |
| 1.463 | 0.097 |
| 1.464 | 0.096 |
| 1.465 | 0.095 |
| 1.466 | 0.095 |
| 1.467 | 0.094 |
| 1.468 | 0.094 |
| 1.469 | 0.093 |
| 1.47 | 0.093 |
| 1.471 | 0.092 |
| 1.472 | 0.092 |
| 1.473 | 0.091 |
| 1.474 | 0.091 |
| 1.475 | 0.09 |
| 1.476 | 0.09 |
| 1.477 | 0.09 |
| 1.478 | 0.089 |
| 1.479 | 0.089 |
| 1.48 | 0.088 |
| 1.481 | 0.088 |
| 1.482 | 0.088 |
| 1.483 | 0.087 |
| 1.484 | 0.087 |
| 1.485 | 0.087 |
| 1.486 | 0.087 |
| 1.487 | 0.086 |
| 1.488 | 0.086 |
| 1.489 | 0.086 |
| 1.49 | 0.086 |
| 1.491 | 0.086 |
| 1.492 | 0.086 |
| 1.493 | 0.085 |
| 1.494 | 0.085 |
| 1.495 | 0.085 |
| 1.496 | 0.085 |
| 1.497 | 0.085 |
| 1.498 | 0.085 |
| 1.499 | 0.085 |
| 1.5 | 0.084 |
| 1.501 | 0.084 |
| 1.502 | 0.084 |
| 1.503 | 0.084 |
| 1.504 | 0.084 |
| 1.505 | 0.084 |
| 1.506 | 0.084 |
| 1.507 | 0.084 |
| 1.508 | 0.083 |
| 1.509 | 0.083 |
| 1.51 | 0.083 |
| 1.511 | 0.083 |
| 1.512 | 0.083 |
| 1.513 | 0.083 |
| 1.514 | 0.083 |
| 1.515 | 0.083 |
| 1.516 | 0.083 |
| 1.517 | 0.083 |
| 1.518 | 0.083 |
| 1.519 | 0.083 |
| 1.52 | 0.083 |
| 1.521 | 0.083 |
| 1.522 | 0.084 |
| 1.523 | 0.084 |
| 1.524 | 0.084 |
| 1.525 | 0.084 |
| 1.526 | 0.084 |
| 1.527 | 0.085 |
| 1.528 | 0.085 |
| 1.529 | 0.085 |
| 1.53 | 0.085 |
| 1.531 | 0.086 |
| 1.532 | 0.086 |
| 1.533 | 0.086 |
| 1.534 | 0.087 |
| 1.535 | 0.087 |
| 1.536 | 0.088 |
| 1.537 | 0.088 |
| 1.538 | 0.088 |
| 1.539 | 0.089 |
| 1.54 | 0.089 |
| 1.541 | 0.089 |
| 1.542 | 0.09 |
| 1.543 | 0.09 |
| 1.544 | 0.09 |
| 1.545 | 0.09 |
| 1.546 | 0.091 |
| 1.547 | 0.091 |
| 1.548 | 0.091 |
| 1.549 | 0.091 |
| 1.55 | 0.091 |
| 1.551 | 0.091 |
| 1.552 | 0.091 |
| 1.553 | 0.091 |
| 1.554 | 0.091 |
| 1.555 | 0.091 |
| 1.556 | 0.091 |
| 1.557 | 0.091 |
| 1.558 | 0.091 |
| 1.559 | 0.09 |
| 1.56 | 0.09 |
| 1.561 | 0.09 |
| 1.562 | 0.09 |
| 1.563 | 0.089 |
| 1.564 | 0.089 |
| 1.565 | 0.089 |
| 1.566 | 0.089 |
| 1.567 | 0.088 |
| 1.568 | 0.088 |
| 1.569 | 0.088 |
| 1.57 | 0.088 |
| 1.571 | 0.088 |
| 1.572 | 0.087 |
| 1.573 | 0.087 |
| 1.574 | 0.087 |
| 1.575 | 0.087 |
| 1.576 | 0.087 |
| 1.577 | 0.087 |
| 1.578 | 0.086 |
| 1.579 | 0.086 |
| 1.58 | 0.086 |
| 1.581 | 0.086 |
| 1.582 | 0.086 |
| 1.583 | 0.086 |
| 1.584 | 0.086 |
| 1.585 | 0.086 |
| 1.586 | 0.086 |
| 1.587 | 0.086 |
| 1.588 | 0.086 |
| 1.589 | 0.086 |
| 1.59 | 0.086 |
| 1.591 | 0.086 |
| 1.592 | 0.086 |
| 1.593 | 0.086 |
| 1.594 | 0.086 |
| 1.595 | 0.086 |
| 1.596 | 0.086 |
| 1.597 | 0.086 |
| 1.598 | 0.086 |
| 1.599 | 0.086 |
| 1.6 | 0.086 |
| 1.601 | 0.086 |
| 1.602 | 0.086 |
| 1.603 | 0.086 |
| 1.604 | 0.086 |
| 1.605 | 0.086 |
| 1.606 | 0.086 |
| 1.607 | 0.086 |
| 1.608 | 0.085 |
| 1.609 | 0.085 |
| 1.61 | 0.085 |
| 1.611 | 0.085 |
| 1.612 | 0.085 |
| 1.613 | 0.085 |
| 1.614 | 0.084 |
| 1.615 | 0.084 |
| 1.616 | 0.084 |
| 1.617 | 0.084 |
| 1.618 | 0.084 |
| 1.619 | 0.083 |
| 1.62 | 0.083 |
| 1.621 | 0.083 |
| 1.622 | 0.082 |
| 1.623 | 0.082 |
| 1.624 | 0.082 |
| 1.625 | 0.081 |
| 1.626 | 0.081 |
| 1.627 | 0.08 |
| 1.628 | 0.08 |
| 1.629 | 0.079 |
| 1.63 | 0.079 |
| 1.631 | 0.078 |
| 1.632 | 0.077 |
| 1.633 | 0.077 |
| 1.634 | 0.076 |
| 1.635 | 0.076 |
| 1.636 | 0.075 |
| 1.637 | 0.074 |
| 1.638 | 0.073 |
| 1.639 | 0.073 |
| 1.64 | 0.072 |
| 1.641 | 0.071 |
| 1.642 | 0.07 |
| 1.643 | 0.07 |
| 1.644 | 0.069 |
| 1.645 | 0.068 |
| 1.646 | 0.067 |
| 1.647 | 0.066 |
| 1.648 | 0.065 |
| 1.649 | 0.064 |
| 1.65 | 0.063 |
| 1.651 | 0.062 |
| 1.652 | 0.061 |
| 1.653 | 0.06 |
| 1.654 | 0.06 |
| 1.655 | 0.059 |
| 1.656 | 0.058 |
| 1.657 | 0.057 |
| 1.658 | 0.056 |
| 1.659 | 0.055 |
| 1.66 | 0.054 |
| 1.661 | 0.053 |
| 1.662 | 0.052 |
| 1.663 | 0.051 |
| 1.664 | 0.05 |
| 1.665 | 0.049 |
| 1.666 | 0.048 |
| 1.667 | 0.047 |
| 1.668 | 0.046 |
| 1.669 | 0.045 |
| 1.67 | 0.044 |
| 1.671 | 0.043 |
| 1.672 | 0.042 |
| 1.673 | 0.041 |
| 1.674 | 0.04 |
| 1.675 | 0.039 |
| 1.676 | 0.039 |
| 1.677 | 0.038 |
| 1.678 | 0.037 |
| 1.679 | 0.036 |
| 1.68 | 0.036 |
| 1.681 | 0.035 |
| 1.682 | 0.034 |
| 1.683 | 0.034 |
| 1.684 | 0.033 |
| 1.685 | 0.032 |
| 1.686 | 0.032 |
| 1.687 | 0.031 |
| 1.688 | 0.031 |
| 1.689 | 0.03 |
| 1.69 | 0.03 |
| 1.691 | 0.029 |
| 1.692 | 0.029 |
| 1.693 | 0.028 |
| 1.694 | 0.028 |
| 1.695 | 0.027 |
| 1.696 | 0.027 |
| 1.697 | 0.026 |
| 1.698 | 0.026 |
| 1.699 | 0.025 |
| 1.7 | 0.025 |
| 1.701 | 0.024 |
| 1.702 | 0.024 |
| 1.703 | 0.023 |
| 1.704 | 0.023 |
| 1.705 | 0.022 |
| 1.706 | 0.022 |
| 1.707 | 0.021 |
| 1.708 | 0.02 |
| 1.709 | 0.02 |
| 1.71 | 0.019 |
| 1.711 | 0.019 |
| 1.712 | 0.018 |
| 1.713 | 0.017 |
| 1.714 | 0.016 |
| 1.715 | 0.016 |
| 1.716 | 0.015 |
| 1.717 | 0.014 |
| 1.718 | 0.014 |
| 1.719 | 0.013 |
| 1.72 | 0.012 |
| 1.721 | 0.011 |
| 1.722 | 0.011 |
| 1.723 | 0.01 |
| 1.724 | 0.009 |
| 1.725 | 0.008 |
| 1.726 | 0.008 |
| 1.727 | 0.007 |
| 1.728 | 0.006 |
| 1.729 | 0.005 |
| 1.73 | 0.005 |
| 1.731 | 0.004 |
| 1.732 | 0.003 |
| 1.733 | 0.002 |
| 1.734 | 0.001 |
| 1.735 | 0 |
| 1.736 | 0 |
| 1.737 | -0.001 |
| 1.738 | -0.002 |
| 1.739 | -0.003 |
| 1.74 | -0.004 |
| 1.741 | -0.005 |
| 1.742 | -0.006 |
| 1.743 | -0.007 |
| 1.744 | -0.008 |
| 1.745 | -0.008 |
| 1.746 | -0.009 |
| 1.747 | -0.01 |
| 1.748 | -0.011 |
| 1.749 | -0.012 |
| 1.75 | -0.013 |
| 1.751 | -0.014 |
| 1.752 | -0.015 |
| 1.753 | -0.015 |
| 1.754 | -0.016 |
| 1.755 | -0.017 |
| 1.756 | -0.017 |
| 1.757 | -0.018 |
| 1.758 | -0.019 |
| 1.759 | -0.019 |
| 1.76 | -0.02 |
| 1.761 | -0.02 |
| 1.762 | -0.02 |
| 1.763 | -0.021 |
| 1.764 | -0.021 |
| 1.765 | -0.021 |
| 1.766 | -0.022 |
| 1.767 | -0.022 |
| 1.768 | -0.022 |
| 1.769 | -0.022 |
| 1.77 | -0.022 |
| 1.771 | -0.022 |
| 1.772 | -0.022 |
| 1.773 | -0.022 |
| 1.774 | -0.022 |
| 1.775 | -0.022 |
| 1.776 | -0.022 |
| 1.777 | -0.022 |
| 1.778 | -0.022 |
| 1.779 | -0.022 |
| 1.78 | -0.022 |
| 1.781 | -0.022 |
| 1.782 | -0.022 |
| 1.783 | -0.022 |
| 1.784 | -0.022 |
| 1.785 | -0.022 |
| 1.786 | -0.022 |
| 1.787 | -0.023 |
| 1.788 | -0.023 |
| 1.789 | -0.023 |
| 1.79 | -0.024 |
| 1.791 | -0.024 |
| 1.792 | -0.024 |
| 1.793 | -0.025 |
| 1.794 | -0.026 |
| 1.795 | -0.026 |
| 1.796 | -0.027 |
| 1.797 | -0.028 |
| 1.798 | -0.029 |
| 1.799 | -0.03 |
| 1.8 | -0.031 |
| 1.801 | -0.032 |
| 1.802 | -0.033 |
| 1.803 | -0.034 |
| 1.804 | -0.035 |
| 1.805 | -0.036 |
| 1.806 | -0.037 |
| 1.807 | -0.038 |
| 1.808 | -0.04 |
| 1.809 | -0.041 |
| 1.81 | -0.042 |
| 1.811 | -0.043 |
| 1.812 | -0.045 |
| 1.813 | -0.046 |
| 1.814 | -0.047 |
| 1.815 | -0.048 |
| 1.816 | -0.049 |
| 1.817 | -0.05 |
| 1.818 | -0.051 |
| 1.819 | -0.051 |
| 1.82 | -0.052 |
| 1.821 | -0.053 |
| 1.822 | -0.053 |
| 1.823 | -0.053 |
| 1.824 | -0.054 |
| 1.825 | -0.054 |
| 1.826 | -0.054 |
| 1.827 | -0.054 |
| 1.828 | -0.054 |
| 1.829 | -0.053 |
| 1.83 | -0.053 |
| 1.831 | -0.052 |
| 1.832 | -0.052 |
| 1.833 | -0.051 |
| 1.834 | -0.05 |
| 1.835 | -0.049 |
| 1.836 | -0.048 |
| 1.837 | -0.047 |
| 1.838 | -0.045 |
| 1.839 | -0.044 |
| 1.84 | -0.042 |
| 1.841 | -0.041 |
| 1.842 | -0.039 |
| 1.843 | -0.038 |
| 1.844 | -0.036 |
| 1.845 | -0.035 |
| 1.846 | -0.033 |
| 1.847 | -0.031 |
| 1.848 | -0.03 |
| 1.849 | -0.028 |
| 1.85 | -0.027 |
| 1.851 | -0.025 |
| 1.852 | -0.023 |
| 1.853 | -0.022 |
| 1.854 | -0.02 |
| 1.855 | -0.019 |
| 1.856 | -0.018 |
| 1.857 | -0.016 |
| 1.858 | -0.015 |
| 1.859 | -0.014 |
| 1.86 | -0.012 |
| 1.861 | -0.011 |
| 1.862 | -0.01 |
| 1.863 | -0.009 |
| 1.864 | -0.008 |
| 1.865 | -0.007 |
| 1.866 | -0.006 |
| 1.867 | -0.005 |
| 1.868 | -0.004 |
| 1.869 | -0.003 |
| 1.87 | -0.003 |
| 1.871 | -0.002 |
| 1.872 | -0.001 |
| 1.873 | -0.001 |
| 1.874 | 0 |
| 1.875 | 0.001 |
| 1.876 | 0.001 |
| 1.877 | 0.002 |
| 1.878 | 0.002 |
| 1.879 | 0.003 |
| 1.88 | 0.003 |
| 1.881 | 0.003 |
| 1.882 | 0.004 |
| 1.883 | 0.004 |
| 1.884 | 0.004 |
| 1.885 | 0.004 |
| 1.886 | 0.004 |
| 1.887 | 0.004 |
| 1.888 | 0.004 |
| 1.889 | 0.004 |
| 1.89 | 0.004 |
| 1.891 | 0.004 |
| 1.892 | 0.003 |
| 1.893 | 0.003 |
| 1.894 | 0.003 |
| 1.895 | 0.002 |
| 1.896 | 0.002 |
| 1.897 | 0.001 |
| 1.898 | 0.001 |
| 1.899 | 0 |
| 1.9 | 0 |
| 1.901 | -0.001 |
| 1.902 | -0.001 |
| 1.903 | -0.002 |
| 1.904 | -0.002 |
| 1.905 | -0.003 |
| 1.906 | -0.003 |
| 1.907 | -0.003 |
| 1.908 | -0.003 |
| 1.909 | -0.004 |
| 1.91 | -0.004 |
| 1.911 | -0.004 |
| 1.912 | -0.003 |
| 1.913 | -0.003 |
| 1.914 | -0.003 |
| 1.915 | -0.003 |
| 1.916 | -0.002 |
| 1.917 | -0.002 |
| 1.918 | -0.001 |
| 1.919 | 0 |
| 1.92 | 0 |
| 1.921 | 0.001 |
| 1.922 | 0.002 |
| 1.923 | 0.003 |
| 1.924 | 0.004 |
| 1.925 | 0.006 |
| 1.926 | 0.007 |
| 1.927 | 0.008 |
| 1.928 | 0.009 |
| 1.929 | 0.011 |
| 1.93 | 0.012 |
| 1.931 | 0.013 |
| 1.932 | 0.014 |
| 1.933 | 0.016 |
| 1.934 | 0.017 |
| 1.935 | 0.018 |
| 1.936 | 0.019 |
| 1.937 | 0.02 |
| 1.938 | 0.021 |
| 1.939 | 0.022 |
| 1.94 | 0.022 |
| 1.941 | 0.023 |
| 1.942 | 0.023 |
| 1.943 | 0.024 |
| 1.944 | 0.024 |
| 1.945 | 0.024 |
| 1.946 | 0.024 |
| 1.947 | 0.024 |
| 1.948 | 0.023 |
| 1.949 | 0.023 |
| 1.95 | 0.022 |
| 1.951 | 0.022 |
| 1.952 | 0.021 |
| 1.953 | 0.02 |
| 1.954 | 0.019 |
| 1.955 | 0.017 |
| 1.956 | 0.016 |
| 1.957 | 0.014 |
| 1.958 | 0.013 |
| 1.959 | 0.011 |
| 1.96 | 0.009 |
| 1.961 | 0.007 |
| 1.962 | 0.006 |
| 1.963 | 0.004 |
| 1.964 | 0.002 |
| 1.965 | 0.001 |
| 1.966 | 0 |
| 1.967 | -0.002 |
| 1.968 | -0.003 |
| 1.969 | -0.003 |
| 1.97 | -0.004 |
| 1.971 | -0.005 |
| 1.972 | -0.005 |
| 1.973 | -0.005 |
| 1.974 | -0.006 |
| 1.975 | -0.006 |
| 1.976 | -0.005 |
| 1.977 | -0.005 |
| 1.978 | -0.005 |
| 1.979 | -0.004 |
| 1.98 | -0.004 |
| 1.981 | -0.003 |
| 1.982 | -0.003 |
| 1.983 | -0.002 |
| 1.984 | -0.001 |
| 1.985 | 0 |
| 1.986 | 0 |
| 1.987 | 0.001 |
| 1.988 | 0.002 |
| 1.989 | 0.003 |
| 1.99 | 0.004 |
| 1.991 | 0.005 |
| 1.992 | 0.006 |
| 1.993 | 0.007 |
| 1.994 | 0.008 |
| 1.995 | 0.009 |
| 1.996 | 0.01 |
| 1.997 | 0.011 |
| 1.998 | 0.012 |
| 1.999 | 0.013 |
| 2.0 | 0.014 |
| 2.001 | 0.015 |
| 2.002 | 0.016 |
| 2.003 | 0.017 |
| 2.004 | 0.018 |
| 2.005 | 0.019 |
| 2.006 | 0.02 |
| 2.007 | 0.021 |
| 2.008 | 0.022 |
| 2.009 | 0.023 |
| 2.01 | 0.024 |
| 2.011 | 0.025 |
| 2.012 | 0.026 |
| 2.013 | 0.027 |
| 2.014 | 0.029 |
| 2.015 | 0.03 |
| 2.016 | 0.031 |
| 2.017 | 0.032 |
| 2.018 | 0.033 |
| 2.019 | 0.034 |
| 2.02 | 0.036 |
| 2.021 | 0.037 |
| 2.022 | 0.039 |
| 2.023 | 0.04 |
| 2.024 | 0.042 |
| 2.025 | 0.044 |
| 2.026 | 0.046 |
| 2.027 | 0.048 |
| 2.028 | 0.05 |
| 2.029 | 0.052 |
| 2.03 | 0.055 |
| 2.031 | 0.058 |
| 2.032 | 0.06 |
| 2.033 | 0.064 |
| 2.034 | 0.067 |
| 2.035 | 0.07 |
| 2.036 | 0.073 |
| 2.037 | 0.077 |
| 2.038 | 0.08 |
| 2.039 | 0.084 |
| 2.04 | 0.087 |
| 2.041 | 0.09 |
| 2.042 | 0.094 |
| 2.043 | 0.096 |
| 2.044 | 0.099 |
| 2.045 | 0.101 |
| 2.046 | 0.103 |
| 2.047 | 0.104 |
| 2.048 | 0.105 |
| 2.049 | 0.106 |
| 2.05 | 0.105 |
| 2.051 | 0.105 |
| 2.052 | 0.103 |
| 2.053 | 0.101 |
| 2.054 | 0.099 |
| 2.055 | 0.096 |
| 2.056 | 0.092 |
| 2.057 | 0.089 |
| 2.058 | 0.084 |
| 2.059 | 0.079 |
| 2.06 | 0.074 |
| 2.061 | 0.068 |
| 2.062 | 0.062 |
| 2.063 | 0.056 |
| 2.064 | 0.049 |
| 2.065 | 0.042 |
| 2.066 | 0.035 |
| 2.067 | 0.027 |
| 2.068 | 0.019 |
| 2.069 | 0.011 |
| 2.07 | 0.003 |
| 2.071 | -0.005 |
| 2.072 | -0.014 |
| 2.073 | -0.022 |
| 2.074 | -0.031 |
| 2.075 | -0.039 |
| 2.076 | -0.048 |
| 2.077 | -0.056 |
| 2.078 | -0.064 |
| 2.079 | -0.073 |
| 2.08 | -0.081 |
| 2.081 | -0.089 |
| 2.082 | -0.097 |
| 2.083 | -0.104 |
| 2.084 | -0.112 |
| 2.085 | -0.119 |
| 2.086 | -0.126 |
| 2.087 | -0.133 |
| 2.088 | -0.139 |
| 2.089 | -0.146 |
| 2.09 | -0.151 |
| 2.091 | -0.157 |
| 2.092 | -0.162 |
| 2.093 | -0.167 |
| 2.094 | -0.171 |
| 2.095 | -0.176 |
| 2.096 | -0.179 |
| 2.097 | -0.183 |
| 2.098 | -0.186 |
| 2.099 | -0.189 |
| 2.1 | -0.191 |
| 2.101 | -0.194 |
| 2.102 | -0.196 |
| 2.103 | -0.198 |
| 2.104 | -0.199 |
| 2.105 | -0.2 |
| 2.106 | -0.201 |
| 2.107 | -0.202 |
| 2.108 | -0.203 |
| 2.109 | -0.203 |
| 2.11 | -0.203 |
| 2.111 | -0.203 |
| 2.112 | -0.203 |
| 2.113 | -0.202 |
| 2.114 | -0.202 |
| 2.115 | -0.201 |
| 2.116 | -0.199 |
| 2.117 | -0.198 |
| 2.118 | -0.197 |
| 2.119 | -0.195 |
| 2.12 | -0.193 |
| 2.121 | -0.191 |
| 2.122 | -0.19 |
| 2.123 | -0.188 |
| 2.124 | -0.186 |
| 2.125 | -0.184 |
| 2.126 | -0.182 |
| 2.127 | -0.181 |
| 2.128 | -0.179 |
| 2.129 | -0.178 |
| 2.13 | -0.177 |
| 2.131 | -0.176 |
| 2.132 | -0.175 |
| 2.133 | -0.175 |
| 2.134 | -0.175 |
| 2.135 | -0.175 |
| 2.136 | -0.175 |
| 2.137 | -0.175 |
| 2.138 | -0.176 |
| 2.139 | -0.177 |
| 2.14 | -0.178 |
| 2.141 | -0.18 |
| 2.142 | -0.182 |
| 2.143 | -0.184 |
| 2.144 | -0.186 |
| 2.145 | -0.188 |
| 2.146 | -0.191 |
| 2.147 | -0.194 |
| 2.148 | -0.197 |
| 2.149 | -0.2 |
| 2.15 | -0.203 |
| 2.151 | -0.206 |
| 2.152 | -0.209 |
| 2.153 | -0.213 |
| 2.154 | -0.216 |
| 2.155 | -0.22 |
| 2.156 | -0.223 |
| 2.157 | -0.226 |
| 2.158 | -0.23 |
| 2.159 | -0.233 |
| 2.16 | -0.236 |
| 2.161 | -0.239 |
| 2.162 | -0.242 |
| 2.163 | -0.245 |
| 2.164 | -0.248 |
| 2.165 | -0.25 |
| 2.166 | -0.253 |
| 2.167 | -0.255 |
| 2.168 | -0.257 |
| 2.169 | -0.258 |
| 2.17 | -0.26 |
| 2.171 | -0.261 |
| 2.172 | -0.262 |
| 2.173 | -0.263 |
| 2.174 | -0.264 |
| 2.175 | -0.264 |
| 2.176 | -0.264 |
| 2.177 | -0.264 |
| 2.178 | -0.264 |
| 2.179 | -0.263 |
| 2.18 | -0.262 |
| 2.181 | -0.261 |
| 2.182 | -0.26 |
| 2.183 | -0.259 |
| 2.184 | -0.257 |
| 2.185 | -0.255 |
| 2.186 | -0.253 |
| 2.187 | -0.251 |
| 2.188 | -0.249 |
| 2.189 | -0.246 |
| 2.19 | -0.244 |
| 2.191 | -0.242 |
| 2.192 | -0.239 |
| 2.193 | -0.237 |
| 2.194 | -0.234 |
| 2.195 | -0.232 |
| 2.196 | -0.229 |
| 2.197 | -0.227 |
| 2.198 | -0.225 |
| 2.199 | -0.222 |
| 2.2 | -0.22 |
| 2.201 | -0.218 |
| 2.202 | -0.216 |
| 2.203 | -0.214 |
| 2.204 | -0.213 |
| 2.205 | -0.211 |
| 2.206 | -0.21 |
| 2.207 | -0.209 |
| 2.208 | -0.208 |
| 2.209 | -0.208 |
| 2.21 | -0.207 |
| 2.211 | -0.207 |
| 2.212 | -0.207 |
| 2.213 | -0.206 |
| 2.214 | -0.207 |
| 2.215 | -0.207 |
| 2.216 | -0.207 |
| 2.217 | -0.208 |
| 2.218 | -0.208 |
| 2.219 | -0.209 |
| 2.22 | -0.209 |
| 2.221 | -0.21 |
| 2.222 | -0.211 |
| 2.223 | -0.212 |
| 2.224 | -0.212 |
| 2.225 | -0.213 |
| 2.226 | -0.214 |
| 2.227 | -0.215 |
| 2.228 | -0.216 |
| 2.229 | -0.217 |
| 2.23 | -0.218 |
| 2.231 | -0.219 |
| 2.232 | -0.22 |
| 2.233 | -0.221 |
| 2.234 | -0.222 |
| 2.235 | -0.223 |
| 2.236 | -0.224 |
| 2.237 | -0.225 |
| 2.238 | -0.226 |
| 2.239 | -0.227 |
| 2.24 | -0.228 |
| 2.241 | -0.229 |
| 2.242 | -0.23 |
| 2.243 | -0.231 |
| 2.244 | -0.232 |
| 2.245 | -0.233 |
| 2.246 | -0.234 |
| 2.247 | -0.235 |
| 2.248 | -0.236 |
| 2.249 | -0.237 |
| 2.25 | -0.238 |
| 2.251 | -0.239 |
| 2.252 | -0.24 |
| 2.253 | -0.241 |
| 2.254 | -0.242 |
| 2.255 | -0.243 |
| 2.256 | -0.244 |
| 2.257 | -0.244 |
| 2.258 | -0.245 |
| 2.259 | -0.245 |
| 2.26 | -0.245 |
| 2.261 | -0.246 |
| 2.262 | -0.246 |
| 2.263 | -0.245 |
| 2.264 | -0.245 |
| 2.265 | -0.245 |
| 2.266 | -0.245 |
| 2.267 | -0.244 |
| 2.268 | -0.243 |
| 2.269 | -0.242 |
| 2.27 | -0.241 |
| 2.271 | -0.24 |
| 2.272 | -0.239 |
| 2.273 | -0.238 |
| 2.274 | -0.236 |
| 2.275 | -0.235 |
| 2.276 | -0.233 |
| 2.277 | -0.231 |
| 2.278 | -0.229 |
| 2.279 | -0.227 |
| 2.28 | -0.225 |
| 2.281 | -0.223 |
| 2.282 | -0.221 |
| 2.283 | -0.219 |
| 2.284 | -0.217 |
| 2.285 | -0.215 |
| 2.286 | -0.213 |
| 2.287 | -0.211 |
| 2.288 | -0.21 |
| 2.289 | -0.208 |
| 2.29 | -0.206 |
| 2.291 | -0.205 |
| 2.292 | -0.203 |
| 2.293 | -0.202 |
| 2.294 | -0.201 |
| 2.295 | -0.2 |
| 2.296 | -0.199 |
| 2.297 | -0.198 |
| 2.298 | -0.198 |
| 2.299 | -0.198 |
| 2.3 | -0.198 |
| 2.301 | -0.198 |
| 2.302 | -0.199 |
| 2.303 | -0.199 |
| 2.304 | -0.2 |
| 2.305 | -0.201 |
| 2.306 | -0.202 |
| 2.307 | -0.204 |
| 2.308 | -0.205 |
| 2.309 | -0.207 |
| 2.31 | -0.208 |
| 2.311 | -0.21 |
| 2.312 | -0.212 |
| 2.313 | -0.214 |
| 2.314 | -0.217 |
| 2.315 | -0.219 |
| 2.316 | -0.221 |
| 2.317 | -0.224 |
| 2.318 | -0.226 |
| 2.319 | -0.228 |
| 2.32 | -0.231 |
| 2.321 | -0.233 |
| 2.322 | -0.236 |
| 2.323 | -0.238 |
| 2.324 | -0.24 |
| 2.325 | -0.243 |
| 2.326 | -0.245 |
| 2.327 | -0.247 |
| 2.328 | -0.25 |
| 2.329 | -0.252 |
| 2.33 | -0.254 |
| 2.331 | -0.256 |
| 2.332 | -0.258 |
| 2.333 | -0.26 |
| 2.334 | -0.262 |
| 2.335 | -0.264 |
| 2.336 | -0.265 |
| 2.337 | -0.267 |
| 2.338 | -0.269 |
| 2.339 | -0.271 |
| 2.34 | -0.272 |
| 2.341 | -0.274 |
| 2.342 | -0.275 |
| 2.343 | -0.277 |
| 2.344 | -0.278 |
| 2.345 | -0.28 |
| 2.346 | -0.281 |
| 2.347 | -0.282 |
| 2.348 | -0.283 |
| 2.349 | -0.285 |
| 2.35 | -0.286 |
| 2.351 | -0.286 |
| 2.352 | -0.287 |
| 2.353 | -0.288 |
| 2.354 | -0.289 |
| 2.355 | -0.289 |
| 2.356 | -0.289 |
| 2.357 | -0.29 |
| 2.358 | -0.29 |
| 2.359 | -0.29 |
| 2.36 | -0.289 |
| 2.361 | -0.289 |
| 2.362 | -0.289 |
| 2.363 | -0.288 |
| 2.364 | -0.288 |
| 2.365 | -0.287 |
| 2.366 | -0.286 |
| 2.367 | -0.285 |
| 2.368 | -0.284 |
| 2.369 | -0.282 |
| 2.37 | -0.281 |
| 2.371 | -0.28 |
| 2.372 | -0.278 |
| 2.373 | -0.276 |
| 2.374 | -0.275 |
| 2.375 | -0.273 |
| 2.376 | -0.271 |
| 2.377 | -0.269 |
| 2.378 | -0.267 |
| 2.379 | -0.265 |
| 2.38 | -0.262 |
| 2.381 | -0.26 |
| 2.382 | -0.258 |
| 2.383 | -0.256 |
| 2.384 | -0.254 |
| 2.385 | -0.252 |
| 2.386 | -0.25 |
| 2.387 | -0.249 |
| 2.388 | -0.247 |
| 2.389 | -0.246 |
| 2.39 | -0.244 |
| 2.391 | -0.243 |
| 2.392 | -0.242 |
| 2.393 | -0.242 |
| 2.394 | -0.241 |
| 2.395 | -0.241 |
| 2.396 | -0.241 |
| 2.397 | -0.241 |
| 2.398 | -0.241 |
| 2.399 | -0.241 |
| 2.4 | -0.242 |
| 2.401 | -0.242 |
| 2.402 | -0.243 |
| 2.403 | -0.244 |
| 2.404 | -0.245 |
| 2.405 | -0.246 |
| 2.406 | -0.247 |
| 2.407 | -0.248 |
| 2.408 | -0.249 |
| 2.409 | -0.25 |
| 2.41 | -0.251 |
| 2.411 | -0.251 |
| 2.412 | -0.252 |
| 2.413 | -0.253 |
| 2.414 | -0.254 |
| 2.415 | -0.254 |
| 2.416 | -0.255 |
| 2.417 | -0.255 |
| 2.418 | -0.255 |
| 2.419 | -0.255 |
| 2.42 | -0.255 |
| 2.421 | -0.255 |
| 2.422 | -0.255 |
| 2.423 | -0.254 |
| 2.424 | -0.253 |
| 2.425 | -0.253 |
| 2.426 | -0.252 |
| 2.427 | -0.251 |
| 2.428 | -0.25 |
| 2.429 | -0.248 |
| 2.43 | -0.247 |
| 2.431 | -0.246 |
| 2.432 | -0.244 |
| 2.433 | -0.242 |
| 2.434 | -0.241 |
| 2.435 | -0.239 |
| 2.436 | -0.237 |
| 2.437 | -0.236 |
| 2.438 | -0.234 |
| 2.439 | -0.232 |
| 2.44 | -0.231 |
| 2.441 | -0.229 |
| 2.442 | -0.227 |
| 2.443 | -0.226 |
| 2.444 | -0.224 |
| 2.445 | -0.223 |
| 2.446 | -0.222 |
| 2.447 | -0.221 |
| 2.448 | -0.22 |
| 2.449 | -0.219 |
| 2.45 | -0.218 |
| 2.451 | -0.218 |
| 2.452 | -0.217 |
| 2.453 | -0.217 |
| 2.454 | -0.217 |
| 2.455 | -0.217 |
| 2.456 | -0.217 |
| 2.457 | -0.217 |
| 2.458 | -0.218 |
| 2.459 | -0.218 |
| 2.46 | -0.219 |
| 2.461 | -0.219 |
| 2.462 | -0.219 |
| 2.463 | -0.22 |
| 2.464 | -0.22 |
| 2.465 | -0.22 |
| 2.466 | -0.22 |
| 2.467 | -0.22 |
| 2.468 | -0.22 |
| 2.469 | -0.22 |
| 2.47 | -0.219 |
| 2.471 | -0.218 |
| 2.472 | -0.217 |
| 2.473 | -0.216 |
| 2.474 | -0.214 |
| 2.475 | -0.212 |
| 2.476 | -0.21 |
| 2.477 | -0.207 |
| 2.478 | -0.204 |
| 2.479 | -0.201 |
| 2.48 | -0.197 |
| 2.481 | -0.193 |
| 2.482 | -0.189 |
| 2.483 | -0.184 |
| 2.484 | -0.179 |
| 2.485 | -0.173 |
| 2.486 | -0.168 |
| 2.487 | -0.161 |
| 2.488 | -0.155 |
| 2.489 | -0.148 |
| 2.49 | -0.141 |
| 2.491 | -0.134 |
| 2.492 | -0.126 |
| 2.493 | -0.118 |
| 2.494 | -0.11 |
| 2.495 | -0.102 |
| 2.496 | -0.093 |
| 2.497 | -0.085 |
| 2.498 | -0.076 |
| 2.499 | -0.067 |
| 2.5 | -0.058 |
| 2.501 | -0.048 |
| 2.502 | -0.039 |
| 2.503 | -0.03 |
| 2.504 | -0.02 |
| 2.505 | -0.011 |
| 2.506 | -0.002 |
| 2.507 | 0.007 |
| 2.508 | 0.016 |
| 2.509 | 0.025 |
| 2.51 | 0.034 |
| 2.511 | 0.042 |
| 2.512 | 0.051 |
| 2.513 | 0.059 |
| 2.514 | 0.066 |
| 2.515 | 0.074 |
| 2.516 | 0.081 |
| 2.517 | 0.088 |
| 2.518 | 0.094 |
| 2.519 | 0.1 |
| 2.52 | 0.106 |
| 2.521 | 0.111 |
| 2.522 | 0.115 |
| 2.523 | 0.119 |
| 2.524 | 0.123 |
| 2.525 | 0.126 |
| 2.526 | 0.129 |
| 2.527 | 0.131 |
| 2.528 | 0.134 |
| 2.529 | 0.135 |
| 2.53 | 0.137 |
| 2.531 | 0.138 |
| 2.532 | 0.139 |
| 2.533 | 0.138 |
| 2.534 | 0.135 |
| 2.535 | 0.128 |
| 2.536 | 0.117 |
| 2.537 | 0.101 |
| 2.538 | 0.08 |
| 2.539 | 0.055 |
| 2.54 | 0.025 |
| 2.541 | -0.01 |
| 2.542 | -0.048 |
| 2.543 | -0.089 |
| 2.544 | -0.133 |
| 2.545 | -0.179 |
| 2.546 | -0.226 |
| 2.547 | -0.275 |
| 2.548 | -0.324 |
| 2.549 | -0.373 |
| 2.55 | -0.422 |
| 2.551 | -0.471 |
| 2.552 | -0.519 |
| 2.553 | -0.565 |
| 2.554 | -0.611 |
| 2.555 | -0.655 |
| 2.556 | -0.697 |
| 2.557 | -0.737 |
| 2.558 | -0.775 |
| 2.559 | -0.811 |
| 2.56 | -0.844 |
| 2.561 | -0.876 |
| 2.562 | -0.905 |
| 2.563 | -0.931 |
| 2.564 | -0.955 |
| 2.565 | -0.977 |
| 2.566 | -0.996 |
| 2.567 | -1.012 |
| 2.568 | -1.026 |
| 2.569 | -1.038 |
| 2.57 | -1.047 |
| 2.571 | -1.054 |
| 2.572 | -1.058 |
| 2.573 | -1.06 |
| 2.574 | -1.059 |
| 2.575 | -1.056 |
| 2.576 | -1.05 |
| 2.577 | -1.043 |
| 2.578 | -1.033 |
| 2.579 | -1.021 |
| 2.58 | -1.007 |
| 2.581 | -0.992 |
| 2.582 | -0.975 |
| 2.583 | -0.956 |
| 2.584 | -0.937 |
| 2.585 | -0.919 |
| 2.586 | -0.903 |
| 2.587 | -0.89 |
| 2.588 | -0.882 |
| 2.589 | -0.88 |
| 2.59 | -0.883 |
| 2.591 | -0.891 |
| 2.592 | -0.905 |
| 2.593 | -0.923 |
| 2.594 | -0.946 |
| 2.595 | -0.972 |
| 2.596 | -1.001 |
| 2.597 | -1.032 |
| 2.598 | -1.064 |
| 2.599 | -1.098 |
| 2.6 | -1.133 |
| 2.601 | -1.167 |
| 2.602 | -1.202 |
| 2.603 | -1.236 |
| 2.604 | -1.268 |
| 2.605 | -1.3 |
| 2.606 | -1.33 |
| 2.607 | -1.359 |
| 2.608 | -1.385 |
| 2.609 | -1.41 |
| 2.61 | -1.432 |
| 2.611 | -1.453 |
| 2.612 | -1.471 |
| 2.613 | -1.486 |
| 2.614 | -1.499 |
| 2.615 | -1.51 |
| 2.616 | -1.519 |
| 2.617 | -1.525 |
| 2.618 | -1.528 |
| 2.619 | -1.529 |
| 2.62 | -1.528 |
| 2.621 | -1.525 |
| 2.622 | -1.52 |
| 2.623 | -1.512 |
| 2.624 | -1.503 |
| 2.625 | -1.491 |
| 2.626 | -1.477 |
| 2.627 | -1.462 |
| 2.628 | -1.444 |
| 2.629 | -1.425 |
| 2.63 | -1.405 |
| 2.631 | -1.383 |
| 2.632 | -1.359 |
| 2.633 | -1.335 |
| 2.634 | -1.309 |
| 2.635 | -1.282 |
| 2.636 | -1.255 |
| 2.637 | -1.226 |
| 2.638 | -1.198 |
| 2.639 | -1.168 |
| 2.64 | -1.139 |
| 2.641 | -1.109 |
| 2.642 | -1.079 |
| 2.643 | -1.049 |
| 2.644 | -1.019 |
| 2.645 | -0.99 |
| 2.646 | -0.96 |
| 2.647 | -0.931 |
| 2.648 | -0.903 |
| 2.649 | -0.875 |
| 2.65 | -0.848 |
| 2.651 | -0.821 |
| 2.652 | -0.795 |
| 2.653 | -0.769 |
| 2.654 | -0.745 |
| 2.655 | -0.721 |
| 2.656 | -0.698 |
| 2.657 | -0.675 |
| 2.658 | -0.654 |
| 2.659 | -0.634 |
| 2.66 | -0.614 |
| 2.661 | -0.595 |
| 2.662 | -0.577 |
| 2.663 | -0.561 |
| 2.664 | -0.545 |
| 2.665 | -0.533 |
| 2.666 | -0.522 |
| 2.667 | -0.515 |
| 2.668 | -0.511 |
| 2.669 | -0.511 |
| 2.67 | -0.515 |
| 2.671 | -0.522 |
| 2.672 | -0.532 |
| 2.673 | -0.545 |
| 2.674 | -0.561 |
| 2.675 | -0.579 |
| 2.676 | -0.599 |
| 2.677 | -0.62 |
| 2.678 | -0.642 |
| 2.679 | -0.665 |
| 2.68 | -0.688 |
| 2.681 | -0.712 |
| 2.682 | -0.736 |
| 2.683 | -0.76 |
| 2.684 | -0.783 |
| 2.685 | -0.806 |
| 2.686 | -0.828 |
| 2.687 | -0.85 |
| 2.688 | -0.87 |
| 2.689 | -0.889 |
| 2.69 | -0.906 |
| 2.691 | -0.923 |
| 2.692 | -0.938 |
| 2.693 | -0.952 |
| 2.694 | -0.964 |
| 2.695 | -0.975 |
| 2.696 | -0.984 |
| 2.697 | -0.991 |
| 2.698 | -0.998 |
| 2.699 | -1.002 |
| 2.7 | -1.005 |
| 2.701 | -1.007 |
| 2.702 | -1.007 |
| 2.703 | -1.006 |
| 2.704 | -1.003 |
| 2.705 | -0.999 |
| 2.706 | -0.994 |
| 2.707 | -0.988 |
| 2.708 | -0.98 |
| 2.709 | -0.972 |
| 2.71 | -0.962 |
| 2.711 | -0.952 |
| 2.712 | -0.94 |
| 2.713 | -0.928 |
| 2.714 | -0.915 |
| 2.715 | -0.902 |
| 2.716 | -0.887 |
| 2.717 | -0.873 |
| 2.718 | -0.858 |
| 2.719 | -0.842 |
| 2.72 | -0.826 |
| 2.721 | -0.81 |
| 2.722 | -0.794 |
| 2.723 | -0.777 |
| 2.724 | -0.761 |
| 2.725 | -0.744 |
| 2.726 | -0.727 |
| 2.727 | -0.711 |
| 2.728 | -0.694 |
| 2.729 | -0.678 |
| 2.73 | -0.662 |
| 2.731 | -0.646 |
| 2.732 | -0.631 |
| 2.733 | -0.615 |
| 2.734 | -0.6 |
| 2.735 | -0.586 |
| 2.736 | -0.572 |
| 2.737 | -0.558 |
| 2.738 | -0.544 |
| 2.739 | -0.531 |
| 2.74 | -0.519 |
| 2.741 | -0.507 |
| 2.742 | -0.495 |
| 2.743 | -0.484 |
| 2.744 | -0.474 |
| 2.745 | -0.464 |
| 2.746 | -0.454 |
| 2.747 | -0.445 |
| 2.748 | -0.436 |
| 2.749 | -0.428 |
| 2.75 | -0.42 |
| 2.751 | -0.413 |
| 2.752 | -0.406 |
| 2.753 | -0.399 |
| 2.754 | -0.393 |
| 2.755 | -0.387 |
| 2.756 | -0.382 |
| 2.757 | -0.377 |
| 2.758 | -0.372 |
| 2.759 | -0.367 |
| 2.76 | -0.363 |
| 2.761 | -0.359 |
| 2.762 | -0.356 |
| 2.763 | -0.352 |
| 2.764 | -0.349 |
| 2.765 | -0.345 |
| 2.766 | -0.342 |
| 2.767 | -0.339 |
| 2.768 | -0.337 |
| 2.769 | -0.334 |
| 2.77 | -0.332 |
| 2.771 | -0.329 |
| 2.772 | -0.327 |
| 2.773 | -0.325 |
| 2.774 | -0.323 |
| 2.775 | -0.321 |
| 2.776 | -0.319 |
| 2.777 | -0.317 |
| 2.778 | -0.315 |
| 2.779 | -0.314 |
| 2.78 | -0.312 |
| 2.781 | -0.311 |
| 2.782 | -0.31 |
| 2.783 | -0.309 |
| 2.784 | -0.308 |
| 2.785 | -0.307 |
| 2.786 | -0.306 |
| 2.787 | -0.305 |
| 2.788 | -0.305 |
| 2.789 | -0.304 |
| 2.79 | -0.304 |
| 2.791 | -0.304 |
| 2.792 | -0.304 |
| 2.793 | -0.304 |
| 2.794 | -0.304 |
| 2.795 | -0.304 |
| 2.796 | -0.304 |
| 2.797 | -0.304 |
| 2.798 | -0.304 |
| 2.799 | -0.304 |
| 2.8 | -0.305 |
| 2.801 | -0.305 |
| 2.802 | -0.305 |
| 2.803 | -0.305 |
| 2.804 | -0.304 |
| 2.805 | -0.304 |
| 2.806 | -0.304 |
| 2.807 | -0.303 |
| 2.808 | -0.303 |
| 2.809 | -0.302 |
| 2.81 | -0.302 |
| 2.811 | -0.301 |
| 2.812 | -0.3 |
| 2.813 | -0.299 |
| 2.814 | -0.298 |
| 2.815 | -0.297 |
| 2.816 | -0.296 |
| 2.817 | -0.295 |
| 2.818 | -0.294 |
| 2.819 | -0.292 |
| 2.82 | -0.291 |
| 2.821 | -0.29 |
| 2.822 | -0.288 |
| 2.823 | -0.287 |
| 2.824 | -0.285 |
| 2.825 | -0.284 |
| 2.826 | -0.283 |
| 2.827 | -0.281 |
| 2.828 | -0.28 |
| 2.829 | -0.279 |
| 2.83 | -0.277 |
| 2.831 | -0.276 |
| 2.832 | -0.275 |
| 2.833 | -0.274 |
| 2.834 | -0.274 |
| 2.835 | -0.273 |
| 2.836 | -0.272 |
| 2.837 | -0.272 |
| 2.838 | -0.272 |
| 2.839 | -0.271 |
| 2.84 | -0.271 |
| 2.841 | -0.272 |
| 2.842 | -0.272 |
| 2.843 | -0.272 |
| 2.844 | -0.273 |
| 2.845 | -0.274 |
| 2.846 | -0.275 |
| 2.847 | -0.275 |
| 2.848 | -0.277 |
| 2.849 | -0.278 |
| 2.85 | -0.279 |
| 2.851 | -0.28 |
| 2.852 | -0.282 |
| 2.853 | -0.284 |
| 2.854 | -0.285 |
| 2.855 | -0.287 |
| 2.856 | -0.289 |
| 2.857 | -0.291 |
| 2.858 | -0.293 |
| 2.859 | -0.294 |
| 2.86 | -0.296 |
| 2.861 | -0.299 |
| 2.862 | -0.301 |
| 2.863 | -0.303 |
| 2.864 | -0.305 |
| 2.865 | -0.307 |
| 2.866 | -0.309 |
| 2.867 | -0.311 |
| 2.868 | -0.313 |
| 2.869 | -0.315 |
| 2.87 | -0.317 |
| 2.871 | -0.32 |
| 2.872 | -0.322 |
| 2.873 | -0.324 |
| 2.874 | -0.325 |
| 2.875 | -0.327 |
| 2.876 | -0.329 |
| 2.877 | -0.331 |
| 2.878 | -0.332 |
| 2.879 | -0.334 |
| 2.88 | -0.335 |
| 2.881 | -0.337 |
| 2.882 | -0.338 |
| 2.883 | -0.34 |
| 2.884 | -0.341 |
| 2.885 | -0.342 |
| 2.886 | -0.343 |
| 2.887 | -0.344 |
| 2.888 | -0.345 |
| 2.889 | -0.347 |
| 2.89 | -0.348 |
| 2.891 | -0.349 |
| 2.892 | -0.35 |
| 2.893 | -0.352 |
| 2.894 | -0.353 |
| 2.895 | -0.355 |
| 2.896 | -0.357 |
| 2.897 | -0.359 |
| 2.898 | -0.361 |
| 2.899 | -0.363 |
| 2.9 | -0.366 |
| 2.901 | -0.369 |
| 2.902 | -0.371 |
| 2.903 | -0.375 |
| 2.904 | -0.378 |
| 2.905 | -0.381 |
| 2.906 | -0.385 |
| 2.907 | -0.389 |
| 2.908 | -0.393 |
| 2.909 | -0.396 |
| 2.91 | -0.4 |
| 2.911 | -0.405 |
| 2.912 | -0.409 |
| 2.913 | -0.413 |
| 2.914 | -0.417 |
| 2.915 | -0.421 |
| 2.916 | -0.426 |
| 2.917 | -0.43 |
| 2.918 | -0.434 |
| 2.919 | -0.438 |
| 2.92 | -0.442 |
| 2.921 | -0.446 |
| 2.922 | -0.45 |
| 2.923 | -0.454 |
| 2.924 | -0.458 |
| 2.925 | -0.462 |
| 2.926 | -0.466 |
| 2.927 | -0.47 |
| 2.928 | -0.474 |
| 2.929 | -0.478 |
| 2.93 | -0.481 |
| 2.931 | -0.485 |
| 2.932 | -0.489 |
| 2.933 | -0.492 |
| 2.934 | -0.496 |
| 2.935 | -0.5 |
| 2.936 | -0.504 |
| 2.937 | -0.508 |
| 2.938 | -0.512 |
| 2.939 | -0.516 |
| 2.94 | -0.52 |
| 2.941 | -0.524 |
| 2.942 | -0.528 |
| 2.943 | -0.532 |
| 2.944 | -0.537 |
| 2.945 | -0.541 |
| 2.946 | -0.546 |
| 2.947 | -0.55 |
| 2.948 | -0.554 |
| 2.949 | -0.559 |
| 2.95 | -0.563 |
| 2.951 | -0.567 |
| 2.952 | -0.571 |
| 2.953 | -0.575 |
| 2.954 | -0.579 |
| 2.955 | -0.583 |
| 2.956 | -0.586 |
| 2.957 | -0.59 |
| 2.958 | -0.593 |
| 2.959 | -0.596 |
| 2.96 | -0.598 |
| 2.961 | -0.6 |
| 2.962 | -0.602 |
| 2.963 | -0.604 |
| 2.964 | -0.605 |
| 2.965 | -0.606 |
| 2.966 | -0.606 |
| 2.967 | -0.606 |
| 2.968 | -0.606 |
| 2.969 | -0.605 |
| 2.97 | -0.604 |
| 2.971 | -0.602 |
| 2.972 | -0.6 |
| 2.973 | -0.598 |
| 2.974 | -0.596 |
| 2.975 | -0.593 |
| 2.976 | -0.59 |
| 2.977 | -0.587 |
| 2.978 | -0.583 |
| 2.979 | -0.58 |
| 2.98 | -0.576 |
| 2.981 | -0.573 |
| 2.982 | -0.569 |
| 2.983 | -0.565 |
| 2.984 | -0.561 |
| 2.985 | -0.557 |
| 2.986 | -0.553 |
| 2.987 | -0.55 |
| 2.988 | -0.546 |
| 2.989 | -0.542 |
| 2.99 | -0.538 |
| 2.991 | -0.535 |
| 2.992 | -0.531 |
| 2.993 | -0.528 |
| 2.994 | -0.525 |
| 2.995 | -0.522 |
| 2.996 | -0.519 |
| 2.997 | -0.517 |
| 2.998 | -0.515 |
| 2.999 | -0.513 |